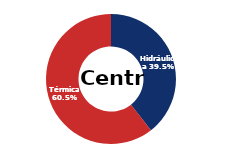
| Category | Centro |
|---|---|
| Eólica | 0 |
| Hidráulica | 1602.181 |
| Solar | 0.006 |
| Térmica | 2457.773 |